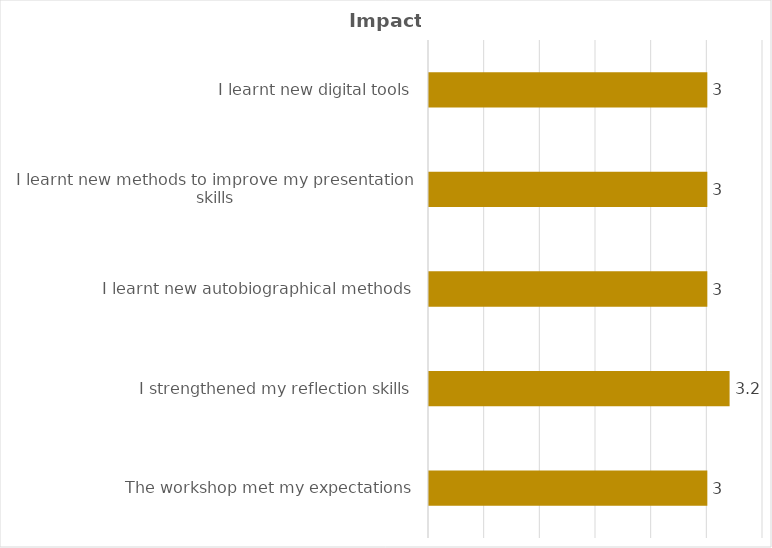
| Category | Series 0 |
|---|---|
| The workshop met my expectations | 3 |
| I strengthened my reflection skills | 3.2 |
| I learnt new autobiographical methods | 3 |
| I learnt new methods to improve my presentation skills | 3 |
| I learnt new digital tools | 3 |